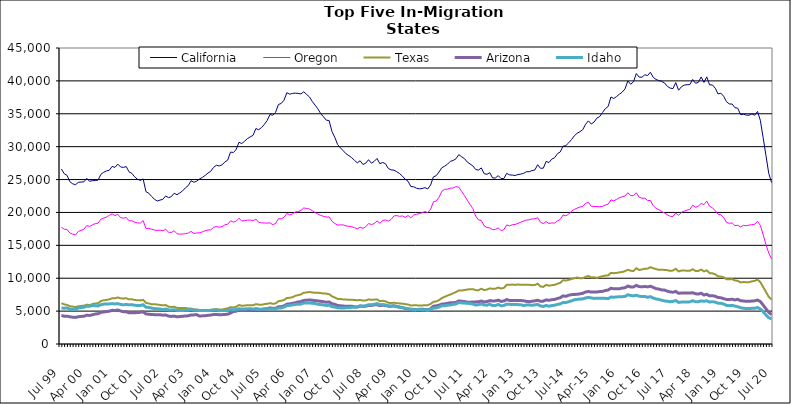
| Category | California | Oregon | Texas | Arizona | Idaho |
|---|---|---|---|---|---|
| Jul 99 | 26605 | 17749 | 6209 | 4339 | 5471 |
| Aug 99 | 25882 | 17447 | 6022 | 4228 | 5444 |
| Sep 99 | 25644 | 17401 | 5941 | 4237 | 5488 |
| Oct 99 | 24669 | 16875 | 5751 | 4134 | 5279 |
| Nov 99 | 24353 | 16701 | 5680 | 4073 | 5260 |
| Dec 99 | 24218 | 16570 | 5619 | 4042 | 5269 |
| Jan 00 | 24574 | 17109 | 5736 | 4142 | 5485 |
| Feb 00 | 24620 | 17295 | 5789 | 4192 | 5530 |
| Mar 00 | 24655 | 17436 | 5826 | 4226 | 5590 |
| Apr 00 | 25195 | 18009 | 5980 | 4375 | 5748 |
| May 00 | 24730 | 17875 | 5897 | 4337 | 5729 |
| Jun 00 | 24825 | 18113 | 6070 | 4444 | 5853 |
| Jul 00 | 24857 | 18294 | 6163 | 4555 | 5824 |
| Aug 00 | 24913 | 18376 | 6199 | 4603 | 5788 |
| Sep 00 | 25792 | 18971 | 6529 | 4804 | 5976 |
| Oct 00 | 26106 | 19135 | 6643 | 4870 | 6058 |
| Nov 00 | 26315 | 19306 | 6705 | 4926 | 6085 |
| Dec 00 | 26415 | 19570 | 6793 | 4991 | 6096 |
| Jan 01 | 26995 | 19781 | 6942 | 5122 | 6119 |
| Feb 01 | 26851 | 19519 | 6948 | 5089 | 6090 |
| Mar 01 | 27352 | 19720 | 7080 | 5180 | 6143 |
| Apr 01 | 26918 | 19221 | 6943 | 5020 | 6020 |
| May 01 | 26848 | 19126 | 6924 | 4899 | 5950 |
| Jun 01 | 26974 | 19241 | 6959 | 4895 | 6019 |
| Jul 01 | 26172 | 18725 | 6778 | 4737 | 5951 |
| Aug 01 | 25943 | 18736 | 6810 | 4757 | 5973 |
| Sep 01 | 25399 | 18514 | 6688 | 4753 | 5895 |
| Oct 01 | 25050 | 18415 | 6650 | 4780 | 5833 |
| Nov 01 | 24873 | 18381 | 6631 | 4826 | 5850 |
| Dec 01 | 25099 | 18765 | 6708 | 4898 | 5969 |
| Jan 02 | 23158 | 17561 | 6261 | 4560 | 5595 |
| Feb 02 | 22926 | 17573 | 6162 | 4531 | 5560 |
| Mar 02 | 22433 | 17452 | 6052 | 4481 | 5458 |
| Apr 02 | 22012 | 17314 | 6046 | 4458 | 5380 |
| May 02 | 21733 | 17267 | 6007 | 4452 | 5358 |
| Jun 02 | 21876 | 17298 | 5933 | 4444 | 5315 |
| Jul 02 | 21997 | 17209 | 5873 | 4383 | 5243 |
| Aug 02 | 22507 | 17436 | 5929 | 4407 | 5315 |
| Sep 02 | 22244 | 17010 | 5672 | 4248 | 5192 |
| Oct 02 | 22406 | 16952 | 5625 | 4191 | 5167 |
| Nov 02 | 22922 | 17223 | 5663 | 4242 | 5221 |
| Dec 02 | 22693 | 16770 | 5499 | 4142 | 5120 |
| Jan 03 | 22964 | 16694 | 5463 | 4166 | 5089 |
| Feb 03 | 23276 | 16727 | 5461 | 4226 | 5077 |
| Mar 03 | 23736 | 16766 | 5486 | 4251 | 5145 |
| Apr 03 | 24079 | 16859 | 5389 | 4289 | 5145 |
| May 03 | 24821 | 17117 | 5378 | 4415 | 5254 |
| Jun 03 | 24592 | 16812 | 5273 | 4426 | 5135 |
| Jul 03 | 24754 | 16875 | 5226 | 4466 | 5124 |
| Aug 03 | 25092 | 16922 | 5181 | 4244 | 5100 |
| Sep 03 | 25316 | 17036 | 5181 | 4279 | 5086 |
| Oct 03 | 25622 | 17228 | 5139 | 4301 | 5110 |
| Nov 03 | 25984 | 17335 | 5175 | 4362 | 5091 |
| Dec 03 | 26269 | 17350 | 5189 | 4396 | 5113 |
| Jan 04 | 26852 | 17734 | 5255 | 4492 | 5152 |
| Feb 04 | 27184 | 17860 | 5301 | 4502 | 5183 |
| Mar 04 | 27062 | 17757 | 5227 | 4443 | 5056 |
| Apr 04 | 27238 | 17840 | 5227 | 4461 | 5104 |
| May 04 | 27671 | 18113 | 5345 | 4493 | 5095 |
| Jun 04 | 27949 | 18201 | 5416 | 4532 | 5103 |
| Jul 04 | 29172 | 18727 | 5597 | 4697 | 5231 |
| Aug 04 | 29122 | 18529 | 5561 | 4945 | 5197 |
| Sep 04 | 29542 | 18678 | 5656 | 4976 | 5237 |
| Oct 04 | 30674 | 19108 | 5922 | 5188 | 5363 |
| Nov 04 | 30472 | 18716 | 5823 | 5106 | 5321 |
| Dec 04 | 30831 | 18755 | 5838 | 5135 | 5312 |
| Jan 05 | 31224 | 18823 | 5906 | 5155 | 5374 |
| Feb 05 | 31495 | 18842 | 5898 | 5168 | 5357 |
| Mar 05 | 31714 | 18738 | 5894 | 5212 | 5313 |
| Apr 05 | 32750 | 18998 | 6060 | 5340 | 5350 |
| May 05 | 32575 | 18504 | 5989 | 5269 | 5276 |
| Jun 05 | 32898 | 18414 | 5954 | 5252 | 5271 |
| Jul 05 | 33384 | 18395 | 6062 | 5322 | 5322 |
| Aug 05 | 33964 | 18381 | 6113 | 5375 | 5316 |
| Sep 05 | 34897 | 18426 | 6206 | 5493 | 5362 |
| Oct 05 | 34780 | 18132 | 6100 | 5408 | 5308 |
| Nov 05 | 35223 | 18332 | 6162 | 5434 | 5314 |
| Dec 05 | 36415 | 19047 | 6508 | 5658 | 5487 |
| Jan 06 | 36567 | 19032 | 6576 | 5688 | 5480 |
| Feb 06 | 37074 | 19257 | 6692 | 5792 | 5616 |
| Mar 06 | 38207 | 19845 | 6993 | 6052 | 5850 |
| Apr 06 | 37976 | 19637 | 7024 | 6101 | 5864 |
| May 06 | 38099 | 19781 | 7114 | 6178 | 5943 |
| Jun 06 | 38141 | 20061 | 7331 | 6276 | 6018 |
| Jul 06 | 38097 | 20111 | 7431 | 6399 | 6046 |
| Aug 06 | 38021 | 20333 | 7542 | 6450 | 6064 |
| Sep 06 | 38349 | 20686 | 7798 | 6627 | 6232 |
| Oct 06 | 37947 | 20591 | 7825 | 6647 | 6216 |
| Nov 06 | 37565 | 20526 | 7907 | 6707 | 6244 |
| Dec 06 | 36884 | 20272 | 7840 | 6648 | 6192 |
| Jan 07 | 36321 | 19984 | 7789 | 6597 | 6151 |
| Feb 07 | 35752 | 19752 | 7799 | 6554 | 6048 |
| Mar 07 | 35025 | 19547 | 7737 | 6487 | 5989 |
| Apr 07 | 34534 | 19412 | 7685 | 6430 | 5937 |
| May 07 | 34022 | 19296 | 7654 | 6353 | 5858 |
| Jun 07 | 33974 | 19318 | 7577 | 6390 | 5886 |
| Jul 07 | 32298 | 18677 | 7250 | 6117 | 5682 |
| Aug 07 | 31436 | 18322 | 7070 | 6034 | 5617 |
| Sep 07 | 30331 | 18087 | 6853 | 5847 | 5500 |
| Oct 07 | 29813 | 18108 | 6839 | 5821 | 5489 |
| Nov 07 | 29384 | 18105 | 6777 | 5769 | 5481 |
| Dec 07 | 28923 | 17949 | 6760 | 5733 | 5499 |
| Jan 08 | 28627 | 17890 | 6721 | 5732 | 5521 |
| Feb 08 | 28328 | 17834 | 6719 | 5749 | 5579 |
| Mar 08 | 27911 | 17680 | 6690 | 5650 | 5614 |
| Apr 08 | 27543 | 17512 | 6656 | 5612 | 5635 |
| May 08 | 27856 | 17754 | 6705 | 5774 | 5798 |
| Jun 08 | 27287 | 17589 | 6593 | 5717 | 5745 |
| Jul 08 | 27495 | 17834 | 6623 | 5761 | 5807 |
| Aug 08 | 28018 | 18309 | 6789 | 5867 | 5982 |
| Sep-08 | 27491 | 18164 | 6708 | 5864 | 5954 |
| Oct 08 | 27771 | 18291 | 6755 | 5942 | 6032 |
| Nov 08 | 28206 | 18706 | 6787 | 5970 | 6150 |
| Dec 08 | 27408 | 18353 | 6505 | 5832 | 5975 |
| Jan 09 | 27601 | 18778 | 6569 | 5890 | 5995 |
| Feb 09 | 27394 | 18863 | 6483 | 5845 | 5936 |
| Mar 09 | 26690 | 18694 | 6273 | 5751 | 5806 |
| Apr 09 | 26461 | 18943 | 6222 | 5735 | 5777 |
| May 09 | 26435 | 19470 | 6272 | 5819 | 5767 |
| Jun 09 | 26187 | 19522 | 6199 | 5700 | 5649 |
| Jul 09 | 25906 | 19408 | 6171 | 5603 | 5617 |
| Aug 09 | 25525 | 19469 | 6128 | 5533 | 5540 |
| Sep 09 | 25050 | 19249 | 6059 | 5405 | 5437 |
| Oct 09 | 24741 | 19529 | 6004 | 5349 | 5369 |
| Nov 09 | 23928 | 19187 | 5854 | 5271 | 5248 |
| Dec 09 | 23899 | 19607 | 5886 | 5261 | 5195 |
| Jan 10 | 23676 | 19703 | 5881 | 5232 | 5234 |
| Feb 10 | 23592 | 19845 | 5850 | 5272 | 5236 |
| Mar 10 | 23634 | 19946 | 5864 | 5278 | 5219 |
| Apr 10 | 23774 | 20134 | 5889 | 5257 | 5201 |
| May 10 | 23567 | 19966 | 5897 | 5172 | 5105 |
| Jun 10 | 24166 | 20464 | 6087 | 5356 | 5237 |
| Jul 10 | 25410 | 21627 | 6417 | 5742 | 5452 |
| Aug 10 | 25586 | 21744 | 6465 | 5797 | 5491 |
| Sep 10 | 26150 | 22314 | 6667 | 5907 | 5609 |
| Oct 10 | 26807 | 23219 | 6986 | 6070 | 5831 |
| Nov 10 | 27033 | 23520 | 7179 | 6100 | 5810 |
| Dec 10 | 27332 | 23551 | 7361 | 6182 | 5898 |
| Jan 11 | 27769 | 23697 | 7525 | 6276 | 5938 |
| Feb 11 | 27898 | 23718 | 7708 | 6267 | 6016 |
| Mar 11 | 28155 | 23921 | 7890 | 6330 | 6081 |
| Apr 11 | 28790 | 23847 | 8146 | 6544 | 6305 |
| May 11 | 28471 | 23215 | 8131 | 6502 | 6248 |
| Jun 11 | 28191 | 22580 | 8199 | 6445 | 6217 |
| Jul 11 | 27678 | 21867 | 8291 | 6368 | 6202 |
| Aug 11 | 27372 | 21203 | 8321 | 6356 | 6146 |
| Sep 11 | 27082 | 20570 | 8341 | 6387 | 6075 |
| Oct 11 | 26528 | 19442 | 8191 | 6402 | 5932 |
| Nov 11 | 26440 | 18872 | 8176 | 6426 | 5968 |
| Dec 11 | 26770 | 18784 | 8401 | 6533 | 6106 |
| Jan 12 | 25901 | 17963 | 8202 | 6390 | 5933 |
| Feb 12 | 25796 | 17718 | 8266 | 6456 | 5900 |
| Mar 12 | 26042 | 17647 | 8456 | 6600 | 6054 |
| Apr 12 | 25239 | 17386 | 8388 | 6534 | 5838 |
| May 12 | 25238 | 17407 | 8401 | 6558 | 5854 |
| Jun 12 | 25593 | 17673 | 8594 | 6669 | 6009 |
| Jul 12 | 25155 | 17237 | 8432 | 6474 | 5817 |
| Aug 12 | 25146 | 17391 | 8536 | 6539 | 5842 |
| Sep 12 | 25942 | 18102 | 8989 | 6759 | 6061 |
| Oct 12 | 25718 | 17953 | 9012 | 6618 | 6027 |
| Nov 12 | 25677 | 18134 | 9032 | 6611 | 6009 |
| Dec 12 | 25619 | 18166 | 8981 | 6601 | 5999 |
| Jan 13 | 25757 | 18344 | 9051 | 6627 | 5989 |
| Feb-13 | 25830 | 18512 | 9001 | 6606 | 5968 |
| Mar-13 | 25940 | 18689 | 9021 | 6577 | 5853 |
| Apr 13 | 26187 | 18844 | 9013 | 6478 | 5925 |
| May 13 | 26192 | 18884 | 9003 | 6431 | 5924 |
| Jun-13 | 26362 | 19013 | 8948 | 6508 | 5896 |
| Jul 13 | 26467 | 19037 | 8958 | 6559 | 5948 |
| Aug 13 | 27253 | 19198 | 9174 | 6655 | 6020 |
| Sep 13 | 26711 | 18501 | 8747 | 6489 | 5775 |
| Oct 13 | 26733 | 18301 | 8681 | 6511 | 5711 |
| Nov 13 | 27767 | 18620 | 8989 | 6709 | 5860 |
| Dec 13 | 27583 | 18320 | 8863 | 6637 | 5740 |
| Jan 14 | 28107 | 18409 | 8939 | 6735 | 5843 |
| Feb-14 | 28313 | 18383 | 8989 | 6779 | 5893 |
| Mar 14 | 28934 | 18696 | 9160 | 6918 | 6015 |
| Apr 14 | 29192 | 18946 | 9291 | 7036 | 6099 |
| May 14 | 30069 | 19603 | 9701 | 7314 | 6304 |
| Jun 14 | 30163 | 19487 | 9641 | 7252 | 6293 |
| Jul-14 | 30587 | 19754 | 9752 | 7415 | 6427 |
| Aug-14 | 31074 | 20201 | 9882 | 7499 | 6557 |
| Sep 14 | 31656 | 20459 | 9997 | 7536 | 6719 |
| Oct 14 | 32037 | 20663 | 10109 | 7555 | 6786 |
| Nov 14 | 32278 | 20825 | 9992 | 7628 | 6831 |
| Dec 14 | 32578 | 20918 | 10006 | 7705 | 6860 |
| Jan 15 | 33414 | 21396 | 10213 | 7906 | 7000 |
| Feb 15 | 33922 | 21518 | 10337 | 7982 | 7083 |
| Mar 15 | 33447 | 20942 | 10122 | 7891 | 7006 |
| Apr-15 | 33731 | 20893 | 10138 | 7906 | 6931 |
| May 15 | 34343 | 20902 | 10053 | 7895 | 6952 |
| Jun-15 | 34572 | 20870 | 10192 | 7973 | 6966 |
| Jul 15 | 35185 | 20916 | 10303 | 8000 | 6949 |
| Aug 15 | 35780 | 21115 | 10399 | 8126 | 6938 |
| Sep 15 | 36109 | 21246 | 10428 | 8207 | 6896 |
| Oct 15 | 37555 | 21908 | 10813 | 8477 | 7140 |
| Nov 15 | 37319 | 21750 | 10763 | 8390 | 7112 |
| Dec 15 | 37624 | 21990 | 10807 | 8395 | 7149 |
| Jan 16 | 37978 | 22248 | 10892 | 8388 | 7201 |
| Feb 16 | 38285 | 22369 | 10951 | 8508 | 7192 |
| Mar 16 | 38792 | 22506 | 11075 | 8547 | 7226 |
| Apr 16 | 39994 | 22999 | 11286 | 8815 | 7487 |
| May 16 | 39488 | 22548 | 11132 | 8673 | 7382 |
| Jun 16 | 39864 | 22556 | 11100 | 8682 | 7315 |
| Jul 16 | 41123 | 22989 | 11516 | 8903 | 7420 |
| Aug 16 | 40573 | 22333 | 11251 | 8731 | 7261 |
| Sep 16 | 40560 | 22162 | 11340 | 8692 | 7216 |
| Oct 16 | 40923 | 22172 | 11456 | 8742 | 7233 |
| Nov 16 | 40817 | 21818 | 11459 | 8685 | 7101 |
| Dec 16 | 41311 | 21815 | 11681 | 8783 | 7203 |
| Jan 17 | 40543 | 21029 | 11524 | 8609 | 6982 |
| Feb 17 | 40218 | 20613 | 11385 | 8416 | 6852 |
| Mar 17 | 40052 | 20425 | 11276 | 8354 | 6775 |
| Apr 17 | 39913 | 20147 | 11297 | 8218 | 6653 |
| May 17 | 39695 | 19910 | 11265 | 8196 | 6552 |
| Jun 17 | 39177 | 19650 | 11225 | 8034 | 6500 |
| Jul 17 | 38901 | 19419 | 11115 | 7923 | 6429 |
| Aug 17 | 38827 | 19389 | 11168 | 7867 | 6479 |
| Sep 17 | 39736 | 19936 | 11426 | 7991 | 6609 |
| Oct 17 | 38576 | 19547 | 11041 | 7708 | 6315 |
| Nov 17 | 39108 | 20013 | 11158 | 7746 | 6381 |
| Dec 17 | 39359 | 20202 | 11185 | 7743 | 6366 |
| Jan 18 | 39420 | 20362 | 11118 | 7736 | 6380 |
| Feb 18 | 39440 | 20476 | 11128 | 7741 | 6407 |
| Mar 18 | 40218 | 21106 | 11362 | 7789 | 6578 |
| Apr 18 | 39637 | 20788 | 11111 | 7642 | 6423 |
| May 18 | 39777 | 20933 | 11097 | 7591 | 6430 |
| Jun 18 | 40602 | 21381 | 11317 | 7721 | 6554 |
| Jul 18 | 39767 | 21189 | 11038 | 7445 | 6489 |
| Aug 18 | 40608 | 21729 | 11200 | 7560 | 6569 |
| Sep 18 | 39395 | 20916 | 10772 | 7318 | 6383 |
| Oct 18 | 39383 | 20724 | 10740 | 7344 | 6429 |
| Nov 18 | 38891 | 20265 | 10605 | 7255 | 6365 |
| Dec 18 | 38013 | 19741 | 10292 | 7069 | 6205 |
| Jan 19 | 38130 | 19643 | 10261 | 7032 | 6203 |
| Feb 19 | 37658 | 19237 | 10132 | 6892 | 6073 |
| Mar 19 | 36831 | 18492 | 9848 | 6766 | 5863 |
| Apr 19 | 36492 | 18349 | 9839 | 6763 | 5827 |
| May 19 | 36481 | 18407 | 9867 | 6809 | 5873 |
| Jun 19 | 35925 | 17998 | 9661 | 6698 | 5761 |
| Jul 19 | 35843 | 18049 | 9598 | 6800 | 5673 |
| Aug 19 | 34870 | 17785 | 9361 | 6577 | 5512 |
| Sep 19 | 34945 | 18038 | 9428 | 6547 | 5437 |
| Oct 19 | 34802 | 17977 | 9385 | 6483 | 5390 |
| Nov 19 | 34775 | 18072 | 9403 | 6511 | 5401 |
| Dec 19 | 34976 | 18140 | 9518 | 6521 | 5419 |
| Jan 20 | 34774 | 18209 | 9594 | 6561 | 5434 |
| Feb 20 | 35352 | 18632 | 9804 | 6682 | 5543 |
| Mar 20 | 34013 | 18041 | 9411 | 6464 | 5330 |
| Apr 20 | 31385 | 16629 | 8666 | 5922 | 4906 |
| May 20 | 28657 | 15123 | 7927 | 5355 | 4419 |
| Jun 20 | 25915 | 13817 | 7164 | 4815 | 3992 |
| Jul 20 | 24545 | 12926 | 6776 | 4457 | 3810 |